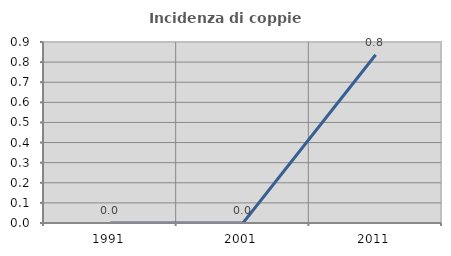
| Category | Incidenza di coppie miste |
|---|---|
| 1991.0 | 0 |
| 2001.0 | 0 |
| 2011.0 | 0.837 |